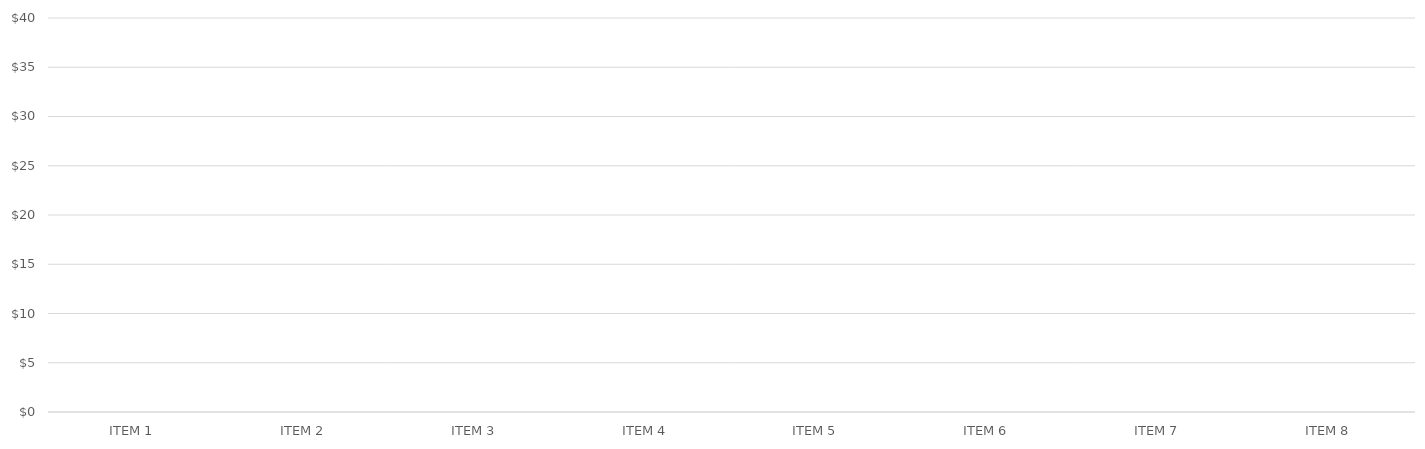
| Category | LUCRO POR ITEM |
|---|---|
| ITEM 1 | 0 |
| ITEM 2 | 0 |
| ITEM 3 | 0 |
| ITEM 4 | 0 |
| ITEM 5 | 0 |
| ITEM 6 | 0 |
| ITEM 7 | 0 |
| ITEM 8 | 0 |